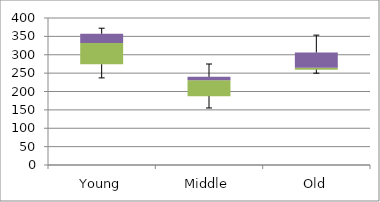
| Category | Min | Q1-Min | Med-Q1 | Q3-Med |
|---|---|---|---|---|
| Young | 237 | 37.1 | 57.7 | 25.3 |
| Middle | 155.2 | 32.2 | 43.4 | 9.1 |
| Old | 249.8 | 9.7 | 5.1 | 41.6 |